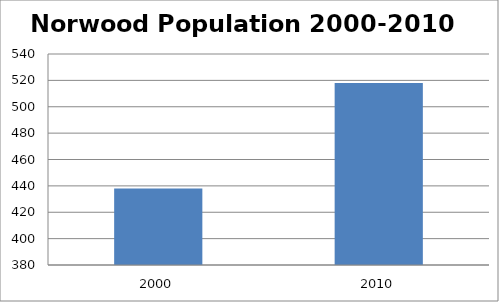
| Category | Series 0 |
|---|---|
| 2000.0 | 438 |
| 2010.0 | 518 |